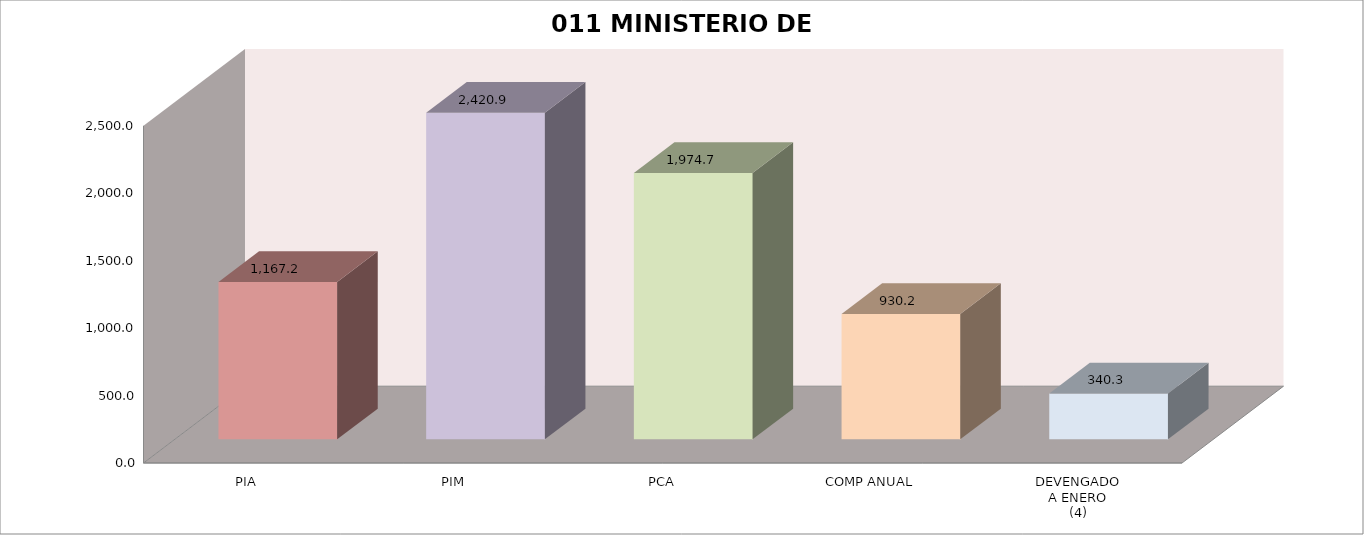
| Category | 011 MINISTERIO DE SALUD |
|---|---|
| PIA | 1167.209 |
| PIM | 2420.946 |
| PCA | 1974.665 |
| COMP ANUAL | 930.235 |
| DEVENGADO
A ENERO
(4) | 340.314 |